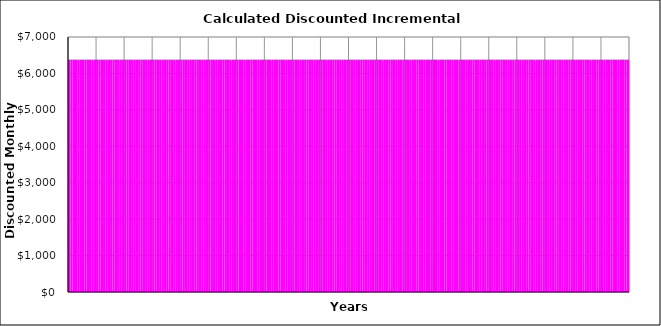
| Category | Stage (1) | Stage (2) | Stage (3) | Stage (4) | Stage (5) | Stage (6) | Stage (7) | Stage (8) | Stage (9) | Stage (10) |
|---|---|---|---|---|---|---|---|---|---|---|
| 0 | 6379.167 | 0 | 0 | 0 | 0 | 0 | 0 | 0 | 0 | 0 |
| 1 | 6379.167 | 0 | 0 | 0 | 0 | 0 | 0 | 0 | 0 | 0 |
| 2 | 6379.167 | 0 | 0 | 0 | 0 | 0 | 0 | 0 | 0 | 0 |
| 3 | 6379.167 | 0 | 0 | 0 | 0 | 0 | 0 | 0 | 0 | 0 |
| 4 | 6379.167 | 0 | 0 | 0 | 0 | 0 | 0 | 0 | 0 | 0 |
| 5 | 6379.167 | 0 | 0 | 0 | 0 | 0 | 0 | 0 | 0 | 0 |
| 6 | 6379.167 | 0 | 0 | 0 | 0 | 0 | 0 | 0 | 0 | 0 |
| 7 | 6379.167 | 0 | 0 | 0 | 0 | 0 | 0 | 0 | 0 | 0 |
| 8 | 6379.167 | 0 | 0 | 0 | 0 | 0 | 0 | 0 | 0 | 0 |
| 9 | 6379.167 | 0 | 0 | 0 | 0 | 0 | 0 | 0 | 0 | 0 |
| 10 | 6379.167 | 0 | 0 | 0 | 0 | 0 | 0 | 0 | 0 | 0 |
| 11 | 6379.167 | 0 | 0 | 0 | 0 | 0 | 0 | 0 | 0 | 0 |
| 12 | 6379.167 | 0 | 0 | 0 | 0 | 0 | 0 | 0 | 0 | 0 |
| 13 | 6379.167 | 0 | 0 | 0 | 0 | 0 | 0 | 0 | 0 | 0 |
| 14 | 6379.167 | 0 | 0 | 0 | 0 | 0 | 0 | 0 | 0 | 0 |
| 15 | 6379.167 | 0 | 0 | 0 | 0 | 0 | 0 | 0 | 0 | 0 |
| 16 | 6379.167 | 0 | 0 | 0 | 0 | 0 | 0 | 0 | 0 | 0 |
| 17 | 6379.167 | 0 | 0 | 0 | 0 | 0 | 0 | 0 | 0 | 0 |
| 18 | 6379.167 | 0 | 0 | 0 | 0 | 0 | 0 | 0 | 0 | 0 |
| 19 | 6379.167 | 0 | 0 | 0 | 0 | 0 | 0 | 0 | 0 | 0 |
| 20 | 6379.167 | 0 | 0 | 0 | 0 | 0 | 0 | 0 | 0 | 0 |
| 21 | 6379.167 | 0 | 0 | 0 | 0 | 0 | 0 | 0 | 0 | 0 |
| 22 | 6379.167 | 0 | 0 | 0 | 0 | 0 | 0 | 0 | 0 | 0 |
| 23 | 6379.167 | 0 | 0 | 0 | 0 | 0 | 0 | 0 | 0 | 0 |
| 24 | 6379.167 | 0 | 0 | 0 | 0 | 0 | 0 | 0 | 0 | 0 |
| 25 | 6379.167 | 0 | 0 | 0 | 0 | 0 | 0 | 0 | 0 | 0 |
| 26 | 6379.167 | 0 | 0 | 0 | 0 | 0 | 0 | 0 | 0 | 0 |
| 27 | 6379.167 | 0 | 0 | 0 | 0 | 0 | 0 | 0 | 0 | 0 |
| 28 | 6379.167 | 0 | 0 | 0 | 0 | 0 | 0 | 0 | 0 | 0 |
| 29 | 6379.167 | 0 | 0 | 0 | 0 | 0 | 0 | 0 | 0 | 0 |
| 30 | 6379.167 | 0 | 0 | 0 | 0 | 0 | 0 | 0 | 0 | 0 |
| 31 | 6379.167 | 0 | 0 | 0 | 0 | 0 | 0 | 0 | 0 | 0 |
| 32 | 6379.167 | 0 | 0 | 0 | 0 | 0 | 0 | 0 | 0 | 0 |
| 33 | 6379.167 | 0 | 0 | 0 | 0 | 0 | 0 | 0 | 0 | 0 |
| 34 | 6379.167 | 0 | 0 | 0 | 0 | 0 | 0 | 0 | 0 | 0 |
| 35 | 6379.167 | 0 | 0 | 0 | 0 | 0 | 0 | 0 | 0 | 0 |
| 36 | 6379.167 | 0 | 0 | 0 | 0 | 0 | 0 | 0 | 0 | 0 |
| 37 | 6379.167 | 0 | 0 | 0 | 0 | 0 | 0 | 0 | 0 | 0 |
| 38 | 6379.167 | 0 | 0 | 0 | 0 | 0 | 0 | 0 | 0 | 0 |
| 39 | 6379.167 | 0 | 0 | 0 | 0 | 0 | 0 | 0 | 0 | 0 |
| 40 | 6379.167 | 0 | 0 | 0 | 0 | 0 | 0 | 0 | 0 | 0 |
| 41 | 6379.167 | 0 | 0 | 0 | 0 | 0 | 0 | 0 | 0 | 0 |
| 42 | 6379.167 | 0 | 0 | 0 | 0 | 0 | 0 | 0 | 0 | 0 |
| 43 | 6379.167 | 0 | 0 | 0 | 0 | 0 | 0 | 0 | 0 | 0 |
| 44 | 6379.167 | 0 | 0 | 0 | 0 | 0 | 0 | 0 | 0 | 0 |
| 45 | 6379.167 | 0 | 0 | 0 | 0 | 0 | 0 | 0 | 0 | 0 |
| 46 | 6379.167 | 0 | 0 | 0 | 0 | 0 | 0 | 0 | 0 | 0 |
| 47 | 6379.167 | 0 | 0 | 0 | 0 | 0 | 0 | 0 | 0 | 0 |
| 48 | 6379.167 | 0 | 0 | 0 | 0 | 0 | 0 | 0 | 0 | 0 |
| 49 | 6379.167 | 0 | 0 | 0 | 0 | 0 | 0 | 0 | 0 | 0 |
| 50 | 6379.167 | 0 | 0 | 0 | 0 | 0 | 0 | 0 | 0 | 0 |
| 51 | 6379.167 | 0 | 0 | 0 | 0 | 0 | 0 | 0 | 0 | 0 |
| 52 | 6379.167 | 0 | 0 | 0 | 0 | 0 | 0 | 0 | 0 | 0 |
| 53 | 6379.167 | 0 | 0 | 0 | 0 | 0 | 0 | 0 | 0 | 0 |
| 54 | 6379.167 | 0 | 0 | 0 | 0 | 0 | 0 | 0 | 0 | 0 |
| 55 | 6379.167 | 0 | 0 | 0 | 0 | 0 | 0 | 0 | 0 | 0 |
| 56 | 6379.167 | 0 | 0 | 0 | 0 | 0 | 0 | 0 | 0 | 0 |
| 57 | 6379.167 | 0 | 0 | 0 | 0 | 0 | 0 | 0 | 0 | 0 |
| 58 | 6379.167 | 0 | 0 | 0 | 0 | 0 | 0 | 0 | 0 | 0 |
| 59 | 6379.167 | 0 | 0 | 0 | 0 | 0 | 0 | 0 | 0 | 0 |
| 60 | 6379.167 | 0 | 0 | 0 | 0 | 0 | 0 | 0 | 0 | 0 |
| 61 | 6379.167 | 0 | 0 | 0 | 0 | 0 | 0 | 0 | 0 | 0 |
| 62 | 6379.167 | 0 | 0 | 0 | 0 | 0 | 0 | 0 | 0 | 0 |
| 63 | 6379.167 | 0 | 0 | 0 | 0 | 0 | 0 | 0 | 0 | 0 |
| 64 | 6379.167 | 0 | 0 | 0 | 0 | 0 | 0 | 0 | 0 | 0 |
| 65 | 6379.167 | 0 | 0 | 0 | 0 | 0 | 0 | 0 | 0 | 0 |
| 66 | 6379.167 | 0 | 0 | 0 | 0 | 0 | 0 | 0 | 0 | 0 |
| 67 | 6379.167 | 0 | 0 | 0 | 0 | 0 | 0 | 0 | 0 | 0 |
| 68 | 6379.167 | 0 | 0 | 0 | 0 | 0 | 0 | 0 | 0 | 0 |
| 69 | 6379.167 | 0 | 0 | 0 | 0 | 0 | 0 | 0 | 0 | 0 |
| 70 | 6379.167 | 0 | 0 | 0 | 0 | 0 | 0 | 0 | 0 | 0 |
| 71 | 6379.167 | 0 | 0 | 0 | 0 | 0 | 0 | 0 | 0 | 0 |
| 72 | 6379.167 | 0 | 0 | 0 | 0 | 0 | 0 | 0 | 0 | 0 |
| 73 | 6379.167 | 0 | 0 | 0 | 0 | 0 | 0 | 0 | 0 | 0 |
| 74 | 6379.167 | 0 | 0 | 0 | 0 | 0 | 0 | 0 | 0 | 0 |
| 75 | 6379.167 | 0 | 0 | 0 | 0 | 0 | 0 | 0 | 0 | 0 |
| 76 | 6379.167 | 0 | 0 | 0 | 0 | 0 | 0 | 0 | 0 | 0 |
| 77 | 6379.167 | 0 | 0 | 0 | 0 | 0 | 0 | 0 | 0 | 0 |
| 78 | 6379.167 | 0 | 0 | 0 | 0 | 0 | 0 | 0 | 0 | 0 |
| 79 | 6379.167 | 0 | 0 | 0 | 0 | 0 | 0 | 0 | 0 | 0 |
| 80 | 6379.167 | 0 | 0 | 0 | 0 | 0 | 0 | 0 | 0 | 0 |
| 81 | 6379.167 | 0 | 0 | 0 | 0 | 0 | 0 | 0 | 0 | 0 |
| 82 | 6379.167 | 0 | 0 | 0 | 0 | 0 | 0 | 0 | 0 | 0 |
| 83 | 6379.167 | 0 | 0 | 0 | 0 | 0 | 0 | 0 | 0 | 0 |
| 84 | 6379.167 | 0 | 0 | 0 | 0 | 0 | 0 | 0 | 0 | 0 |
| 85 | 6379.167 | 0 | 0 | 0 | 0 | 0 | 0 | 0 | 0 | 0 |
| 86 | 6379.167 | 0 | 0 | 0 | 0 | 0 | 0 | 0 | 0 | 0 |
| 87 | 6379.167 | 0 | 0 | 0 | 0 | 0 | 0 | 0 | 0 | 0 |
| 88 | 6379.167 | 0 | 0 | 0 | 0 | 0 | 0 | 0 | 0 | 0 |
| 89 | 6379.167 | 0 | 0 | 0 | 0 | 0 | 0 | 0 | 0 | 0 |
| 90 | 6379.167 | 0 | 0 | 0 | 0 | 0 | 0 | 0 | 0 | 0 |
| 91 | 6379.167 | 0 | 0 | 0 | 0 | 0 | 0 | 0 | 0 | 0 |
| 92 | 6379.167 | 0 | 0 | 0 | 0 | 0 | 0 | 0 | 0 | 0 |
| 93 | 6379.167 | 0 | 0 | 0 | 0 | 0 | 0 | 0 | 0 | 0 |
| 94 | 6379.167 | 0 | 0 | 0 | 0 | 0 | 0 | 0 | 0 | 0 |
| 95 | 6379.167 | 0 | 0 | 0 | 0 | 0 | 0 | 0 | 0 | 0 |
| 96 | 6379.167 | 0 | 0 | 0 | 0 | 0 | 0 | 0 | 0 | 0 |
| 97 | 6379.167 | 0 | 0 | 0 | 0 | 0 | 0 | 0 | 0 | 0 |
| 98 | 6379.167 | 0 | 0 | 0 | 0 | 0 | 0 | 0 | 0 | 0 |
| 99 | 6379.167 | 0 | 0 | 0 | 0 | 0 | 0 | 0 | 0 | 0 |
| 100 | 6379.167 | 0 | 0 | 0 | 0 | 0 | 0 | 0 | 0 | 0 |
| 101 | 6379.167 | 0 | 0 | 0 | 0 | 0 | 0 | 0 | 0 | 0 |
| 102 | 6379.167 | 0 | 0 | 0 | 0 | 0 | 0 | 0 | 0 | 0 |
| 103 | 6379.167 | 0 | 0 | 0 | 0 | 0 | 0 | 0 | 0 | 0 |
| 104 | 6379.167 | 0 | 0 | 0 | 0 | 0 | 0 | 0 | 0 | 0 |
| 105 | 6379.167 | 0 | 0 | 0 | 0 | 0 | 0 | 0 | 0 | 0 |
| 106 | 6379.167 | 0 | 0 | 0 | 0 | 0 | 0 | 0 | 0 | 0 |
| 107 | 6379.167 | 0 | 0 | 0 | 0 | 0 | 0 | 0 | 0 | 0 |
| 108 | 6379.167 | 0 | 0 | 0 | 0 | 0 | 0 | 0 | 0 | 0 |
| 109 | 6379.167 | 0 | 0 | 0 | 0 | 0 | 0 | 0 | 0 | 0 |
| 110 | 6379.167 | 0 | 0 | 0 | 0 | 0 | 0 | 0 | 0 | 0 |
| 111 | 6379.167 | 0 | 0 | 0 | 0 | 0 | 0 | 0 | 0 | 0 |
| 112 | 6379.167 | 0 | 0 | 0 | 0 | 0 | 0 | 0 | 0 | 0 |
| 113 | 6379.167 | 0 | 0 | 0 | 0 | 0 | 0 | 0 | 0 | 0 |
| 114 | 6379.167 | 0 | 0 | 0 | 0 | 0 | 0 | 0 | 0 | 0 |
| 115 | 6379.167 | 0 | 0 | 0 | 0 | 0 | 0 | 0 | 0 | 0 |
| 116 | 6379.167 | 0 | 0 | 0 | 0 | 0 | 0 | 0 | 0 | 0 |
| 117 | 6379.167 | 0 | 0 | 0 | 0 | 0 | 0 | 0 | 0 | 0 |
| 118 | 6379.167 | 0 | 0 | 0 | 0 | 0 | 0 | 0 | 0 | 0 |
| 119 | 6379.167 | 0 | 0 | 0 | 0 | 0 | 0 | 0 | 0 | 0 |
| 120 | 6379.167 | 0 | 0 | 0 | 0 | 0 | 0 | 0 | 0 | 0 |
| 121 | 6379.167 | 0 | 0 | 0 | 0 | 0 | 0 | 0 | 0 | 0 |
| 122 | 6379.167 | 0 | 0 | 0 | 0 | 0 | 0 | 0 | 0 | 0 |
| 123 | 6379.167 | 0 | 0 | 0 | 0 | 0 | 0 | 0 | 0 | 0 |
| 124 | 6379.167 | 0 | 0 | 0 | 0 | 0 | 0 | 0 | 0 | 0 |
| 125 | 6379.167 | 0 | 0 | 0 | 0 | 0 | 0 | 0 | 0 | 0 |
| 126 | 6379.167 | 0 | 0 | 0 | 0 | 0 | 0 | 0 | 0 | 0 |
| 127 | 6379.167 | 0 | 0 | 0 | 0 | 0 | 0 | 0 | 0 | 0 |
| 128 | 6379.167 | 0 | 0 | 0 | 0 | 0 | 0 | 0 | 0 | 0 |
| 129 | 6379.167 | 0 | 0 | 0 | 0 | 0 | 0 | 0 | 0 | 0 |
| 130 | 6379.167 | 0 | 0 | 0 | 0 | 0 | 0 | 0 | 0 | 0 |
| 131 | 6379.167 | 0 | 0 | 0 | 0 | 0 | 0 | 0 | 0 | 0 |
| 132 | 6379.167 | 0 | 0 | 0 | 0 | 0 | 0 | 0 | 0 | 0 |
| 133 | 6379.167 | 0 | 0 | 0 | 0 | 0 | 0 | 0 | 0 | 0 |
| 134 | 6379.167 | 0 | 0 | 0 | 0 | 0 | 0 | 0 | 0 | 0 |
| 135 | 6379.167 | 0 | 0 | 0 | 0 | 0 | 0 | 0 | 0 | 0 |
| 136 | 6379.167 | 0 | 0 | 0 | 0 | 0 | 0 | 0 | 0 | 0 |
| 137 | 6379.167 | 0 | 0 | 0 | 0 | 0 | 0 | 0 | 0 | 0 |
| 138 | 6379.167 | 0 | 0 | 0 | 0 | 0 | 0 | 0 | 0 | 0 |
| 139 | 6379.167 | 0 | 0 | 0 | 0 | 0 | 0 | 0 | 0 | 0 |
| 140 | 6379.167 | 0 | 0 | 0 | 0 | 0 | 0 | 0 | 0 | 0 |
| 141 | 6379.167 | 0 | 0 | 0 | 0 | 0 | 0 | 0 | 0 | 0 |
| 142 | 6379.167 | 0 | 0 | 0 | 0 | 0 | 0 | 0 | 0 | 0 |
| 143 | 6379.167 | 0 | 0 | 0 | 0 | 0 | 0 | 0 | 0 | 0 |
| 144 | 6379.167 | 0 | 0 | 0 | 0 | 0 | 0 | 0 | 0 | 0 |
| 145 | 6379.167 | 0 | 0 | 0 | 0 | 0 | 0 | 0 | 0 | 0 |
| 146 | 6379.167 | 0 | 0 | 0 | 0 | 0 | 0 | 0 | 0 | 0 |
| 147 | 6379.167 | 0 | 0 | 0 | 0 | 0 | 0 | 0 | 0 | 0 |
| 148 | 6379.167 | 0 | 0 | 0 | 0 | 0 | 0 | 0 | 0 | 0 |
| 149 | 6379.167 | 0 | 0 | 0 | 0 | 0 | 0 | 0 | 0 | 0 |
| 150 | 6379.167 | 0 | 0 | 0 | 0 | 0 | 0 | 0 | 0 | 0 |
| 151 | 6379.167 | 0 | 0 | 0 | 0 | 0 | 0 | 0 | 0 | 0 |
| 152 | 6379.167 | 0 | 0 | 0 | 0 | 0 | 0 | 0 | 0 | 0 |
| 153 | 6379.167 | 0 | 0 | 0 | 0 | 0 | 0 | 0 | 0 | 0 |
| 154 | 6379.167 | 0 | 0 | 0 | 0 | 0 | 0 | 0 | 0 | 0 |
| 155 | 6379.167 | 0 | 0 | 0 | 0 | 0 | 0 | 0 | 0 | 0 |
| 156 | 6379.167 | 0 | 0 | 0 | 0 | 0 | 0 | 0 | 0 | 0 |
| 157 | 6379.167 | 0 | 0 | 0 | 0 | 0 | 0 | 0 | 0 | 0 |
| 158 | 6379.167 | 0 | 0 | 0 | 0 | 0 | 0 | 0 | 0 | 0 |
| 159 | 6379.167 | 0 | 0 | 0 | 0 | 0 | 0 | 0 | 0 | 0 |
| 160 | 6379.167 | 0 | 0 | 0 | 0 | 0 | 0 | 0 | 0 | 0 |
| 161 | 6379.167 | 0 | 0 | 0 | 0 | 0 | 0 | 0 | 0 | 0 |
| 162 | 6379.167 | 0 | 0 | 0 | 0 | 0 | 0 | 0 | 0 | 0 |
| 163 | 6379.167 | 0 | 0 | 0 | 0 | 0 | 0 | 0 | 0 | 0 |
| 164 | 6379.167 | 0 | 0 | 0 | 0 | 0 | 0 | 0 | 0 | 0 |
| 165 | 6379.167 | 0 | 0 | 0 | 0 | 0 | 0 | 0 | 0 | 0 |
| 166 | 6379.167 | 0 | 0 | 0 | 0 | 0 | 0 | 0 | 0 | 0 |
| 167 | 6379.167 | 0 | 0 | 0 | 0 | 0 | 0 | 0 | 0 | 0 |
| 168 | 6379.167 | 0 | 0 | 0 | 0 | 0 | 0 | 0 | 0 | 0 |
| 169 | 6379.167 | 0 | 0 | 0 | 0 | 0 | 0 | 0 | 0 | 0 |
| 170 | 6379.167 | 0 | 0 | 0 | 0 | 0 | 0 | 0 | 0 | 0 |
| 171 | 6379.167 | 0 | 0 | 0 | 0 | 0 | 0 | 0 | 0 | 0 |
| 172 | 6379.167 | 0 | 0 | 0 | 0 | 0 | 0 | 0 | 0 | 0 |
| 173 | 6379.167 | 0 | 0 | 0 | 0 | 0 | 0 | 0 | 0 | 0 |
| 174 | 6379.167 | 0 | 0 | 0 | 0 | 0 | 0 | 0 | 0 | 0 |
| 175 | 6379.167 | 0 | 0 | 0 | 0 | 0 | 0 | 0 | 0 | 0 |
| 176 | 6379.167 | 0 | 0 | 0 | 0 | 0 | 0 | 0 | 0 | 0 |
| 177 | 6379.167 | 0 | 0 | 0 | 0 | 0 | 0 | 0 | 0 | 0 |
| 178 | 6379.167 | 0 | 0 | 0 | 0 | 0 | 0 | 0 | 0 | 0 |
| 179 | 6379.167 | 0 | 0 | 0 | 0 | 0 | 0 | 0 | 0 | 0 |
| 180 | 6379.167 | 0 | 0 | 0 | 0 | 0 | 0 | 0 | 0 | 0 |
| 181 | 6379.167 | 0 | 0 | 0 | 0 | 0 | 0 | 0 | 0 | 0 |
| 182 | 6379.167 | 0 | 0 | 0 | 0 | 0 | 0 | 0 | 0 | 0 |
| 183 | 6379.167 | 0 | 0 | 0 | 0 | 0 | 0 | 0 | 0 | 0 |
| 184 | 6379.167 | 0 | 0 | 0 | 0 | 0 | 0 | 0 | 0 | 0 |
| 185 | 6379.167 | 0 | 0 | 0 | 0 | 0 | 0 | 0 | 0 | 0 |
| 186 | 6379.167 | 0 | 0 | 0 | 0 | 0 | 0 | 0 | 0 | 0 |
| 187 | 6379.167 | 0 | 0 | 0 | 0 | 0 | 0 | 0 | 0 | 0 |
| 188 | 6379.167 | 0 | 0 | 0 | 0 | 0 | 0 | 0 | 0 | 0 |
| 189 | 6379.167 | 0 | 0 | 0 | 0 | 0 | 0 | 0 | 0 | 0 |
| 190 | 6379.167 | 0 | 0 | 0 | 0 | 0 | 0 | 0 | 0 | 0 |
| 191 | 6379.167 | 0 | 0 | 0 | 0 | 0 | 0 | 0 | 0 | 0 |
| 192 | 6379.167 | 0 | 0 | 0 | 0 | 0 | 0 | 0 | 0 | 0 |
| 193 | 6379.167 | 0 | 0 | 0 | 0 | 0 | 0 | 0 | 0 | 0 |
| 194 | 6379.167 | 0 | 0 | 0 | 0 | 0 | 0 | 0 | 0 | 0 |
| 195 | 6379.167 | 0 | 0 | 0 | 0 | 0 | 0 | 0 | 0 | 0 |
| 196 | 6379.167 | 0 | 0 | 0 | 0 | 0 | 0 | 0 | 0 | 0 |
| 197 | 6379.167 | 0 | 0 | 0 | 0 | 0 | 0 | 0 | 0 | 0 |
| 198 | 6379.167 | 0 | 0 | 0 | 0 | 0 | 0 | 0 | 0 | 0 |
| 199 | 6379.167 | 0 | 0 | 0 | 0 | 0 | 0 | 0 | 0 | 0 |
| 200 | 6379.167 | 0 | 0 | 0 | 0 | 0 | 0 | 0 | 0 | 0 |
| 201 | 6379.167 | 0 | 0 | 0 | 0 | 0 | 0 | 0 | 0 | 0 |
| 202 | 6379.167 | 0 | 0 | 0 | 0 | 0 | 0 | 0 | 0 | 0 |
| 203 | 6379.167 | 0 | 0 | 0 | 0 | 0 | 0 | 0 | 0 | 0 |
| 204 | 6379.167 | 0 | 0 | 0 | 0 | 0 | 0 | 0 | 0 | 0 |
| 205 | 6379.167 | 0 | 0 | 0 | 0 | 0 | 0 | 0 | 0 | 0 |
| 206 | 6379.167 | 0 | 0 | 0 | 0 | 0 | 0 | 0 | 0 | 0 |
| 207 | 6379.167 | 0 | 0 | 0 | 0 | 0 | 0 | 0 | 0 | 0 |
| 208 | 6379.167 | 0 | 0 | 0 | 0 | 0 | 0 | 0 | 0 | 0 |
| 209 | 6379.167 | 0 | 0 | 0 | 0 | 0 | 0 | 0 | 0 | 0 |
| 210 | 6379.167 | 0 | 0 | 0 | 0 | 0 | 0 | 0 | 0 | 0 |
| 211 | 6379.167 | 0 | 0 | 0 | 0 | 0 | 0 | 0 | 0 | 0 |
| 212 | 6379.167 | 0 | 0 | 0 | 0 | 0 | 0 | 0 | 0 | 0 |
| 213 | 6379.167 | 0 | 0 | 0 | 0 | 0 | 0 | 0 | 0 | 0 |
| 214 | 6379.167 | 0 | 0 | 0 | 0 | 0 | 0 | 0 | 0 | 0 |
| 215 | 6379.167 | 0 | 0 | 0 | 0 | 0 | 0 | 0 | 0 | 0 |
| 216 | 6379.167 | 0 | 0 | 0 | 0 | 0 | 0 | 0 | 0 | 0 |
| 217 | 6379.167 | 0 | 0 | 0 | 0 | 0 | 0 | 0 | 0 | 0 |
| 218 | 6379.167 | 0 | 0 | 0 | 0 | 0 | 0 | 0 | 0 | 0 |
| 219 | 6379.167 | 0 | 0 | 0 | 0 | 0 | 0 | 0 | 0 | 0 |
| 220 | 6379.167 | 0 | 0 | 0 | 0 | 0 | 0 | 0 | 0 | 0 |
| 221 | 6379.167 | 0 | 0 | 0 | 0 | 0 | 0 | 0 | 0 | 0 |
| 222 | 6379.167 | 0 | 0 | 0 | 0 | 0 | 0 | 0 | 0 | 0 |
| 223 | 6379.167 | 0 | 0 | 0 | 0 | 0 | 0 | 0 | 0 | 0 |
| 224 | 6379.167 | 0 | 0 | 0 | 0 | 0 | 0 | 0 | 0 | 0 |
| 225 | 6379.167 | 0 | 0 | 0 | 0 | 0 | 0 | 0 | 0 | 0 |
| 226 | 6379.167 | 0 | 0 | 0 | 0 | 0 | 0 | 0 | 0 | 0 |
| 227 | 6379.167 | 0 | 0 | 0 | 0 | 0 | 0 | 0 | 0 | 0 |
| 228 | 6379.167 | 0 | 0 | 0 | 0 | 0 | 0 | 0 | 0 | 0 |
| 229 | 6379.167 | 0 | 0 | 0 | 0 | 0 | 0 | 0 | 0 | 0 |
| 230 | 6379.167 | 0 | 0 | 0 | 0 | 0 | 0 | 0 | 0 | 0 |
| 231 | 6379.167 | 0 | 0 | 0 | 0 | 0 | 0 | 0 | 0 | 0 |
| 232 | 6379.167 | 0 | 0 | 0 | 0 | 0 | 0 | 0 | 0 | 0 |
| 233 | 6379.167 | 0 | 0 | 0 | 0 | 0 | 0 | 0 | 0 | 0 |
| 234 | 6379.167 | 0 | 0 | 0 | 0 | 0 | 0 | 0 | 0 | 0 |
| 235 | 6379.167 | 0 | 0 | 0 | 0 | 0 | 0 | 0 | 0 | 0 |
| 236 | 6379.167 | 0 | 0 | 0 | 0 | 0 | 0 | 0 | 0 | 0 |
| 237 | 6379.167 | 0 | 0 | 0 | 0 | 0 | 0 | 0 | 0 | 0 |
| 238 | 6379.167 | 0 | 0 | 0 | 0 | 0 | 0 | 0 | 0 | 0 |
| 239 | 6379.167 | 0 | 0 | 0 | 0 | 0 | 0 | 0 | 0 | 0 |